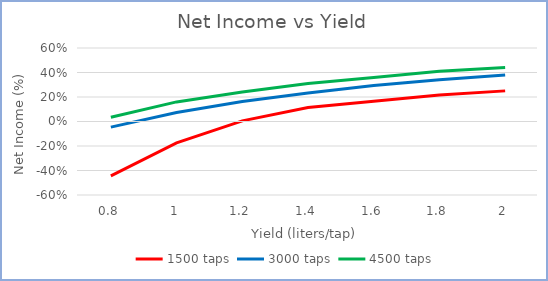
| Category | 1500 taps | 3000 taps | 4500 taps |
|---|---|---|---|
| 0.8 | -0.444 | -0.046 | 0.034 |
| 1.0 | -0.175 | 0.073 | 0.16 |
| 1.2 | 0.005 | 0.164 | 0.24 |
| 1.4 | 0.114 | 0.233 | 0.31 |
| 1.6 | 0.166 | 0.294 | 0.36 |
| 1.8 | 0.217 | 0.34 | 0.41 |
| 2.0 | 0.25 | 0.38 | 0.44 |